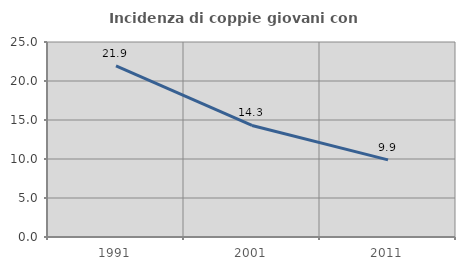
| Category | Incidenza di coppie giovani con figli |
|---|---|
| 1991.0 | 21.927 |
| 2001.0 | 14.303 |
| 2011.0 | 9.892 |